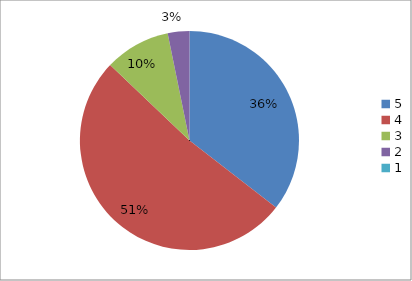
| Category | Series 0 | Series 1 |
|---|---|---|
| 5.0 | 35.5 | 35.5 |
| 4.0 | 51.6 | 51.6 |
| 3.0 | 9.7 | 9.7 |
| 2.0 | 3.2 | 3.2 |
| 1.0 | 0 | 0 |